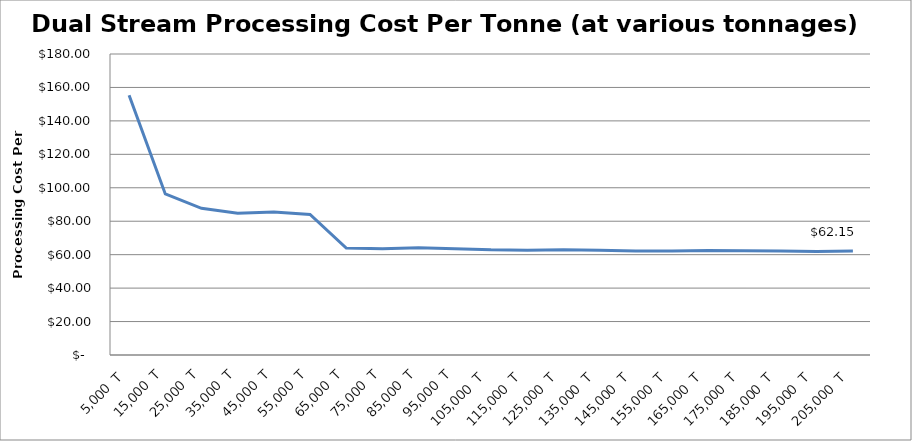
| Category | Net Cost Per Tonne |
|---|---|
| 5000.0 | 155.314 |
| 15000.0 | 96.311 |
| 25000.0 | 87.731 |
| 35000.0 | 84.761 |
| 45000.0 | 85.568 |
| 55000.0 | 84.071 |
| 65000.0 | 63.975 |
| 75000.0 | 63.571 |
| 85000.0 | 64.096 |
| 95000.0 | 63.556 |
| 105000.0 | 62.882 |
| 115000.0 | 62.714 |
| 125000.0 | 62.981 |
| 135000.0 | 62.683 |
| 145000.0 | 62.256 |
| 155000.0 | 62.171 |
| 165000.0 | 62.527 |
| 175000.0 | 62.323 |
| 185000.0 | 62.248 |
| 195000.0 | 61.851 |
| 205000.0 | 62.153 |